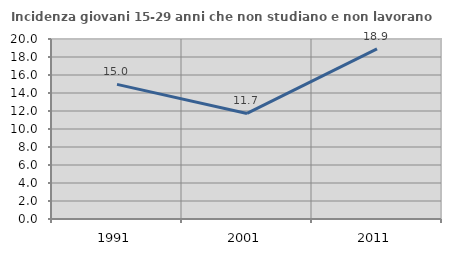
| Category | Incidenza giovani 15-29 anni che non studiano e non lavorano  |
|---|---|
| 1991.0 | 14.958 |
| 2001.0 | 11.73 |
| 2011.0 | 18.898 |